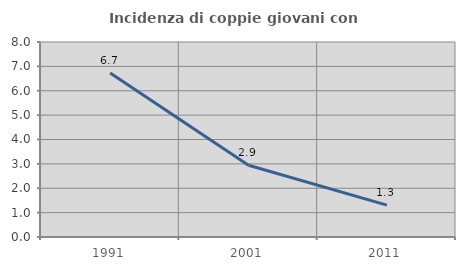
| Category | Incidenza di coppie giovani con figli |
|---|---|
| 1991.0 | 6.731 |
| 2001.0 | 2.941 |
| 2011.0 | 1.307 |